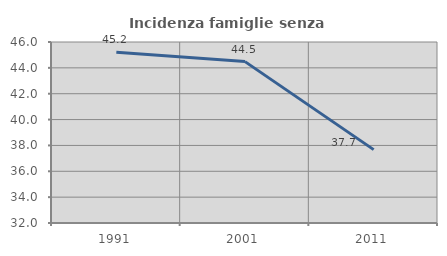
| Category | Incidenza famiglie senza nuclei |
|---|---|
| 1991.0 | 45.205 |
| 2001.0 | 44.483 |
| 2011.0 | 37.676 |